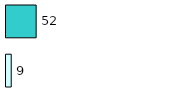
| Category | Series 0 | Series 1 |
|---|---|---|
| 0 | 9 | 52 |